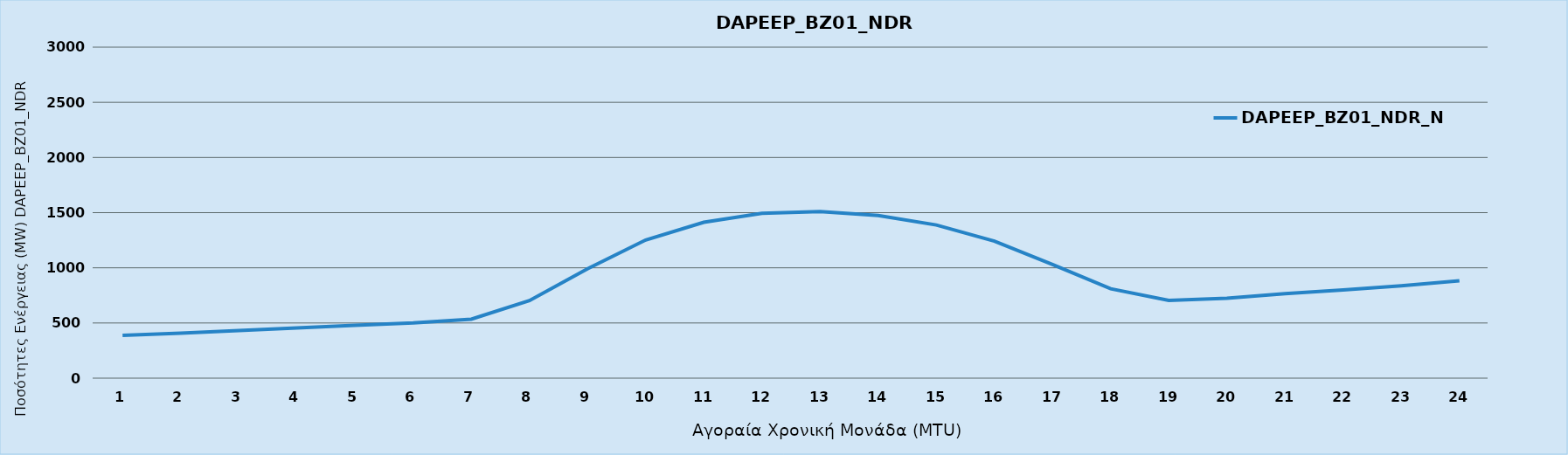
| Category | DAPEEP_BZ01_NDR_N1 |
|---|---|
| 0 | 388 |
| 1 | 408 |
| 2 | 431 |
| 3 | 456 |
| 4 | 479 |
| 5 | 501 |
| 6 | 535 |
| 7 | 703 |
| 8 | 992 |
| 9 | 1252 |
| 10 | 1413 |
| 11 | 1494 |
| 12 | 1510 |
| 13 | 1474 |
| 14 | 1388 |
| 15 | 1242 |
| 16 | 1030 |
| 17 | 810 |
| 18 | 704 |
| 19 | 724 |
| 20 | 765 |
| 21 | 799 |
| 22 | 838 |
| 23 | 883 |